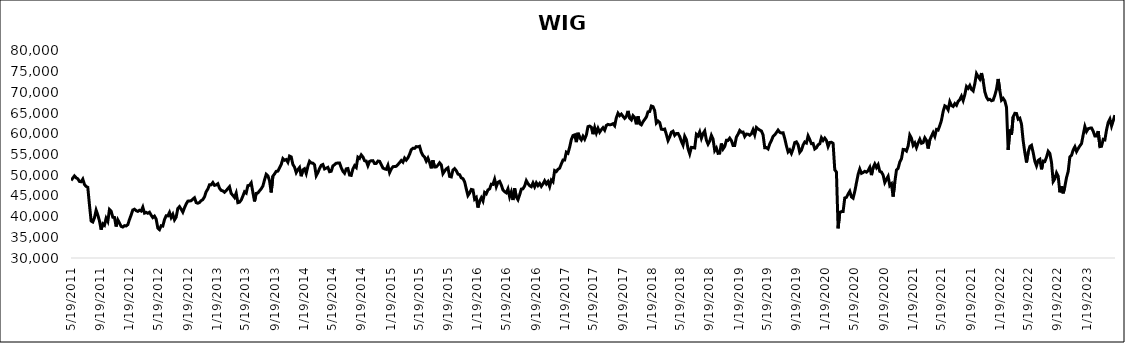
| Category | WIG |
|---|---|
| 5/19/11 | 48747.55 |
| 6/2/11 | 49824.93 |
| 6/9/11 | 49378.82 |
| 6/16/11 | 49129.21 |
| 6/23/11 | 48485.26 |
| 6/30/11 | 48414.36 |
| 7/7/11 | 49057.05 |
| 7/14/11 | 47768.38 |
| 7/21/11 | 47291.31 |
| 7/28/11 | 47071.4 |
| 8/4/11 | 42828.22 |
| 8/11/11 | 38934.71 |
| 8/18/11 | 38697.56 |
| 8/25/11 | 39715.27 |
| 9/1/11 | 41553.09 |
| 9/8/11 | 40405.17 |
| 9/15/11 | 38945 |
| 9/22/11 | 36851.2 |
| 9/29/11 | 38264.32 |
| 10/6/11 | 37915.03 |
| 10/13/11 | 39608.13 |
| 10/20/11 | 38835.92 |
| 10/27/11 | 41708.88 |
| 11/3/11 | 41313.92 |
| 11/10/11 | 39853.18 |
| 11/17/11 | 39797.19 |
| 11/24/11 | 37607.27 |
| 12/1/11 | 39215.21 |
| 12/8/11 | 38474.28 |
| 12/15/11 | 37637.47 |
| 12/22/11 | 37478.7 |
| 12/29/11 | 37814.52 |
| 1/5/12 | 37739.39 |
| 1/12/12 | 38062.87 |
| 1/19/12 | 39288.13 |
| 1/26/12 | 40392.48 |
| 2/2/12 | 41602.24 |
| 2/9/12 | 41792.46 |
| 2/16/12 | 41430.3 |
| 2/23/12 | 41258.14 |
| 3/1/12 | 41533.87 |
| 3/8/12 | 41337.97 |
| 3/15/12 | 42281.33 |
| 3/22/12 | 40834.43 |
| 3/29/12 | 41028.06 |
| 4/5/12 | 40802.41 |
| 4/12/12 | 41053.82 |
| 4/19/12 | 40354.53 |
| 4/26/12 | 39761.78 |
| 5/3/12 | 40114.73 |
| 5/10/12 | 39404.16 |
| 5/17/12 | 37228.88 |
| 5/24/12 | 36852.75 |
| 5/31/12 | 37793.58 |
| 6/7/12 | 37707.25 |
| 6/14/12 | 39286.64 |
| 6/21/12 | 40207.61 |
| 6/28/12 | 40165.34 |
| 7/5/12 | 41013.96 |
| 7/12/12 | 39778.1 |
| 7/19/12 | 40545.64 |
| 7/26/12 | 39213.05 |
| 8/2/12 | 39876.95 |
| 8/9/12 | 41976.63 |
| 8/16/12 | 42408.41 |
| 8/23/12 | 41795.63 |
| 8/30/12 | 41077.44 |
| 9/6/12 | 42134.93 |
| 9/13/12 | 43047.41 |
| 9/20/12 | 43737.02 |
| 9/27/12 | 43763.3 |
| 10/4/12 | 43840.23 |
| 10/11/12 | 44224.67 |
| 10/18/12 | 44550.12 |
| 10/25/12 | 43374.6 |
| 11/1/12 | 43232.44 |
| 11/8/12 | 43429.42 |
| 11/15/12 | 43845.94 |
| 11/22/12 | 44121.53 |
| 11/29/12 | 44787.84 |
| 12/6/12 | 46019.97 |
| 12/13/12 | 46653.84 |
| 12/20/12 | 47701.82 |
| 12/27/12 | 47673.03 |
| 1/3/13 | 48222.72 |
| 1/10/13 | 47546.91 |
| 1/17/13 | 47661.37 |
| 1/24/13 | 47942.04 |
| 1/31/13 | 46840.15 |
| 2/7/13 | 46329.66 |
| 2/14/13 | 46211.54 |
| 2/21/13 | 45879.9 |
| 2/28/13 | 46280.36 |
| 3/7/13 | 46745.26 |
| 3/14/13 | 47223.68 |
| 3/21/13 | 45580.47 |
| 3/28/13 | 45147.57 |
| 4/4/13 | 44623.89 |
| 4/11/13 | 45688.48 |
| 4/18/13 | 43364.7 |
| 4/25/13 | 43482.18 |
| 5/2/13 | 43991.51 |
| 5/9/13 | 44943.16 |
| 5/16/13 | 45992.03 |
| 5/23/13 | 45687.76 |
| 5/30/13 | 47476.64 |
| 6/6/13 | 47573.66 |
| 6/13/13 | 48152.82 |
| 6/20/13 | 45870 |
| 6/27/13 | 43667.37 |
| 7/4/13 | 45613.75 |
| 7/11/13 | 45712.72 |
| 7/18/13 | 46221.23 |
| 7/25/13 | 46713.02 |
| 8/1/13 | 47370.81 |
| 8/8/13 | 48862.88 |
| 8/15/13 | 50223.95 |
| 8/22/13 | 49846.48 |
| 8/29/13 | 48676.45 |
| 9/5/13 | 45830.66 |
| 9/12/13 | 49771.55 |
| 9/19/13 | 50300.53 |
| 9/26/13 | 50936.34 |
| 10/3/13 | 50982.03 |
| 10/10/13 | 51806.83 |
| 10/17/13 | 52573.59 |
| 10/24/13 | 53994.46 |
| 10/31/13 | 53607.86 |
| 11/7/13 | 53785.07 |
| 11/14/13 | 53127.16 |
| 11/21/13 | 54621.21 |
| 11/28/13 | 54420.19 |
| 12/5/13 | 52597.13 |
| 12/12/13 | 51947.96 |
| 12/19/13 | 50631.75 |
| 12/26/13 | 51362.3 |
| 1/2/14 | 51865.89 |
| 1/9/14 | 49753.03 |
| 1/16/14 | 51288.7 |
| 1/23/14 | 51569.21 |
| 1/30/14 | 50417.17 |
| 2/6/14 | 52138.87 |
| 2/13/14 | 53349.65 |
| 2/20/14 | 52967.02 |
| 2/27/14 | 52906.04 |
| 3/6/14 | 52487.84 |
| 3/13/14 | 49878.65 |
| 3/20/14 | 50627.71 |
| 3/27/14 | 51642.99 |
| 4/3/14 | 52376.18 |
| 4/10/14 | 52580.73 |
| 4/17/14 | 51510.98 |
| 4/24/14 | 51705.76 |
| 5/1/14 | 51892.77 |
| 5/8/14 | 50851.25 |
| 5/15/14 | 50944.5 |
| 5/22/14 | 52244.13 |
| 5/29/14 | 52553.48 |
| 6/5/14 | 52901.29 |
| 6/12/14 | 52927.91 |
| 6/19/14 | 52937.45 |
| 6/26/14 | 51815.43 |
| 7/3/14 | 50951.73 |
| 7/10/14 | 50474.36 |
| 7/17/14 | 51527.37 |
| 7/24/14 | 51613.47 |
| 7/31/14 | 50037.12 |
| 8/7/14 | 49958.67 |
| 8/14/14 | 51512.57 |
| 8/21/14 | 52294.93 |
| 8/28/14 | 51882.01 |
| 9/4/14 | 54358.49 |
| 9/11/14 | 54065.27 |
| 9/18/14 | 54906.1 |
| 9/25/14 | 54411.77 |
| 10/2/14 | 53498.77 |
| 10/9/14 | 53416.03 |
| 10/16/14 | 52297.79 |
| 10/23/14 | 53335.43 |
| 10/30/14 | 53492 |
| 11/6/14 | 53512.14 |
| 11/13/14 | 52816.35 |
| 11/20/14 | 52848.54 |
| 11/27/14 | 53415.63 |
| 12/4/14 | 53346.86 |
| 12/11/14 | 52550.03 |
| 12/18/14 | 51739.04 |
| 12/25/14 | 51511.68 |
| 1/1/15 | 51416.08 |
| 1/8/15 | 52391 |
| 1/15/15 | 50616.63 |
| 1/22/15 | 51484.81 |
| 1/29/15 | 52040.24 |
| 2/5/15 | 52107.26 |
| 2/12/15 | 52139.81 |
| 2/19/15 | 52572.95 |
| 2/26/15 | 53042.6 |
| 3/5/15 | 53546.4 |
| 3/12/15 | 53136.13 |
| 3/19/15 | 54148.48 |
| 3/26/15 | 53649.9 |
| 4/2/15 | 54179.04 |
| 4/9/15 | 55063.85 |
| 4/16/15 | 56165.1 |
| 4/23/15 | 56492.95 |
| 4/30/15 | 56477.69 |
| 5/7/15 | 56911.34 |
| 5/14/15 | 56845.83 |
| 5/21/15 | 56990.6 |
| 5/28/15 | 55556.13 |
| 6/4/15 | 54749.74 |
| 6/11/15 | 54357.69 |
| 6/18/15 | 53408.53 |
| 6/25/15 | 54141.2 |
| 7/2/15 | 53074.71 |
| 7/9/15 | 51658.71 |
| 7/16/15 | 53588.24 |
| 7/23/15 | 51986.22 |
| 7/30/15 | 52011.81 |
| 8/6/15 | 52418.07 |
| 8/13/15 | 52995.96 |
| 8/20/15 | 52508.32 |
| 8/27/15 | 50366.09 |
| 9/3/15 | 50977.06 |
| 9/10/15 | 51527.08 |
| 9/17/15 | 51801.58 |
| 9/24/15 | 49701.31 |
| 10/1/15 | 49593.95 |
| 10/8/15 | 51222.77 |
| 10/15/15 | 51599.62 |
| 10/22/15 | 51094.29 |
| 10/29/15 | 50262.68 |
| 11/5/15 | 50125.85 |
| 11/12/15 | 49358.2 |
| 11/19/15 | 49177.74 |
| 11/26/15 | 48418.14 |
| 12/3/15 | 46693.09 |
| 12/10/15 | 45093.65 |
| 12/17/15 | 45684.05 |
| 12/24/15 | 46564.08 |
| 12/31/15 | 46467.38 |
| 1/7/16 | 44195.91 |
| 1/14/16 | 44596.08 |
| 1/21/16 | 42180.3 |
| 1/28/16 | 43778.96 |
| 2/4/16 | 44557.64 |
| 2/11/16 | 43741.96 |
| 2/18/16 | 45834.88 |
| 2/25/16 | 45497.77 |
| 3/3/16 | 46448.27 |
| 3/10/16 | 46686.74 |
| 3/17/16 | 47833.39 |
| 3/24/16 | 47778.01 |
| 3/31/16 | 49017.35 |
| 4/7/16 | 47231.36 |
| 4/14/16 | 48285.21 |
| 4/21/16 | 48514.39 |
| 4/28/16 | 47643.7 |
| 5/5/16 | 46430.16 |
| 5/12/16 | 46022.02 |
| 5/19/16 | 45751.68 |
| 5/26/16 | 46695.37 |
| 6/2/16 | 44772.72 |
| 6/9/16 | 45940.12 |
| 6/16/16 | 44007.81 |
| 6/23/16 | 46826.85 |
| 6/30/16 | 44748.53 |
| 7/7/16 | 44077.16 |
| 7/14/16 | 45246.26 |
| 7/21/16 | 46639.17 |
| 7/28/16 | 46718.98 |
| 8/4/16 | 47407.09 |
| 8/11/16 | 48675.96 |
| 8/18/16 | 47967.07 |
| 8/25/16 | 47464.07 |
| 9/1/16 | 47221.32 |
| 9/8/16 | 48129.15 |
| 9/15/16 | 47198.39 |
| 9/22/16 | 48154.88 |
| 9/29/16 | 47494.62 |
| 10/6/16 | 48014.44 |
| 10/13/16 | 47303.15 |
| 10/20/16 | 47894.17 |
| 10/27/16 | 48651.28 |
| 11/3/16 | 47899.61 |
| 11/10/16 | 48447.59 |
| 11/17/16 | 47274.21 |
| 11/24/16 | 48824.83 |
| 12/1/16 | 48404.21 |
| 12/8/16 | 51123.43 |
| 12/15/16 | 50881.35 |
| 12/22/16 | 51423.71 |
| 12/29/16 | 51703.91 |
| 1/5/17 | 52721.67 |
| 1/12/17 | 53650.94 |
| 1/19/17 | 53654.99 |
| 1/26/17 | 55560.23 |
| 2/2/17 | 55303.11 |
| 2/9/17 | 56785.52 |
| 2/16/17 | 58610.28 |
| 2/23/17 | 59583.89 |
| 3/2/17 | 59743.64 |
| 3/9/17 | 57986.6 |
| 3/16/17 | 60247.18 |
| 3/23/17 | 59093.68 |
| 3/30/17 | 58527.2 |
| 4/6/17 | 59406.36 |
| 4/13/17 | 58695.36 |
| 4/20/17 | 59700.07 |
| 4/27/17 | 61731.8 |
| 5/4/17 | 61862.8 |
| 5/11/17 | 61598.78 |
| 5/18/17 | 59901.12 |
| 5/25/17 | 61536.22 |
| 6/1/17 | 60181.96 |
| 6/8/17 | 61312.68 |
| 6/15/17 | 60381.07 |
| 6/22/17 | 60987.33 |
| 6/29/17 | 61475.96 |
| 7/6/17 | 60869.83 |
| 7/13/17 | 62018.68 |
| 7/20/17 | 62269.72 |
| 7/27/17 | 62171.7 |
| 8/3/17 | 62231.08 |
| 8/10/17 | 62451.57 |
| 8/17/17 | 61949.4 |
| 8/24/17 | 63886.54 |
| 8/31/17 | 64973.76 |
| 9/7/17 | 64381.87 |
| 9/14/17 | 64748.47 |
| 9/21/17 | 64209.19 |
| 9/28/17 | 63729.77 |
| 10/5/17 | 64185.71 |
| 10/12/17 | 65529.1 |
| 10/19/17 | 63745 |
| 10/26/17 | 63342.71 |
| 11/2/17 | 64375.83 |
| 11/9/17 | 63923.62 |
| 11/16/17 | 62299.29 |
| 11/23/17 | 64207.77 |
| 11/30/17 | 62440.31 |
| 12/7/17 | 62164.65 |
| 12/14/17 | 62916.39 |
| 12/21/17 | 63477.25 |
| 12/28/17 | 64053.47 |
| 1/4/18 | 65297.96 |
| 1/11/18 | 65379.88 |
| 1/18/18 | 66709.12 |
| 1/25/18 | 66561.79 |
| 2/1/18 | 65585.79 |
| 2/8/18 | 62604.89 |
| 2/15/18 | 63078.16 |
| 2/22/18 | 62717.27 |
| 3/1/18 | 61116.96 |
| 3/8/18 | 61036.99 |
| 3/15/18 | 61156.91 |
| 3/22/18 | 59862.55 |
| 3/29/18 | 58377.42 |
| 4/5/18 | 59244.04 |
| 4/12/18 | 60393.23 |
| 4/19/18 | 60629.81 |
| 4/26/18 | 59628.04 |
| 5/3/18 | 60066.46 |
| 5/10/18 | 60091.26 |
| 5/17/18 | 59337.27 |
| 5/24/18 | 58189.49 |
| 5/31/18 | 57282.73 |
| 6/7/18 | 59412.76 |
| 6/14/18 | 58603.93 |
| 6/21/18 | 56425.25 |
| 6/28/18 | 55169.77 |
| 7/5/18 | 56719.88 |
| 7/12/18 | 56671.44 |
| 7/19/18 | 56585.5 |
| 7/26/18 | 59871.2 |
| 8/2/18 | 59484.35 |
| 8/9/18 | 60455.75 |
| 8/16/18 | 58921.44 |
| 8/23/18 | 60044.45 |
| 8/30/18 | 60690.32 |
| 9/6/18 | 58469.6 |
| 9/13/18 | 57493.38 |
| 9/20/18 | 58231.57 |
| 9/27/18 | 59616.27 |
| 10/4/18 | 58736.08 |
| 10/11/18 | 55941.06 |
| 10/18/18 | 56560.93 |
| 10/25/18 | 55271.63 |
| 11/1/18 | 55312.71 |
| 11/8/18 | 57655.73 |
| 11/15/18 | 56329.01 |
| 11/22/18 | 56932.62 |
| 11/29/18 | 58412.94 |
| 12/6/18 | 58409.09 |
| 12/13/18 | 58952.55 |
| 12/20/18 | 58349.03 |
| 12/27/18 | 57183.28 |
| 1/3/19 | 57192.42 |
| 1/10/19 | 59219.23 |
| 1/17/19 | 59894.9 |
| 1/24/19 | 60791.02 |
| 1/31/19 | 60367.42 |
| 2/7/19 | 60422.38 |
| 2/14/19 | 59348.4 |
| 2/21/19 | 59938.07 |
| 2/28/19 | 59903.7 |
| 3/7/19 | 59638.3 |
| 3/14/19 | 60002.72 |
| 3/21/19 | 60976.51 |
| 3/28/19 | 59752.66 |
| 4/4/19 | 61533.27 |
| 4/11/19 | 61168.92 |
| 4/18/19 | 60910.11 |
| 4/25/19 | 60680.62 |
| 5/2/19 | 59744.3 |
| 5/9/19 | 56637.25 |
| 5/16/19 | 56664.5 |
| 5/23/19 | 56351.13 |
| 5/30/19 | 57566.83 |
| 6/6/19 | 58360.5 |
| 6/13/19 | 59374.38 |
| 6/20/19 | 59738.56 |
| 6/27/19 | 60293.37 |
| 7/4/19 | 60888.98 |
| 7/11/19 | 60362.11 |
| 7/18/19 | 60192.6 |
| 7/25/19 | 60249.72 |
| 8/1/19 | 58863.73 |
| 8/8/19 | 57102.69 |
| 8/15/19 | 55634.7 |
| 8/22/19 | 56118.92 |
| 8/29/19 | 55273.05 |
| 9/5/19 | 56358.3 |
| 9/12/19 | 57886.6 |
| 9/19/19 | 58053.03 |
| 9/26/19 | 57377.87 |
| 10/3/19 | 55523.06 |
| 10/10/19 | 56034.97 |
| 10/17/19 | 57297.12 |
| 10/24/19 | 58012.97 |
| 10/31/19 | 57783.02 |
| 11/7/19 | 59492.22 |
| 11/14/19 | 58622.1 |
| 11/21/19 | 57618.54 |
| 11/28/19 | 57669.94 |
| 12/5/19 | 56338.75 |
| 12/12/19 | 56621.06 |
| 12/19/19 | 57346.95 |
| 12/26/19 | 57569.71 |
| 1/2/20 | 59048.28 |
| 1/9/20 | 58397.17 |
| 1/16/20 | 58962.37 |
| 1/23/20 | 58401.85 |
| 1/30/20 | 56923.36 |
| 2/6/20 | 57900.04 |
| 2/13/20 | 57960.23 |
| 2/20/20 | 57693.12 |
| 2/27/20 | 51318.69 |
| 3/5/20 | 50753.91 |
| 3/12/20 | 37164.02 |
| 3/19/20 | 41041.92 |
| 3/26/20 | 41202.98 |
| 4/2/20 | 41219.51 |
| 4/9/20 | 44499.23 |
| 4/16/20 | 44645.12 |
| 4/23/20 | 45450.43 |
| 4/30/20 | 46117 |
| 5/7/20 | 44769.05 |
| 5/14/20 | 44450.71 |
| 5/21/20 | 46073.39 |
| 5/28/20 | 48144.34 |
| 6/4/20 | 50202.54 |
| 6/11/20 | 51486.94 |
| 6/18/20 | 50445.13 |
| 6/25/20 | 50658.89 |
| 7/2/20 | 50937.18 |
| 7/9/20 | 50726.22 |
| 7/16/20 | 51121.23 |
| 7/23/20 | 51890.42 |
| 7/30/20 | 50024.63 |
| 8/6/20 | 51816.87 |
| 8/13/20 | 52706.25 |
| 8/20/20 | 51842.65 |
| 8/27/20 | 52528.67 |
| 9/3/20 | 50915.67 |
| 9/10/20 | 50757.07 |
| 9/17/20 | 50035.54 |
| 9/24/20 | 48241.11 |
| 10/1/20 | 49035.41 |
| 10/8/20 | 49727.34 |
| 10/15/20 | 47482 |
| 10/22/20 | 47910.38 |
| 10/29/20 | 44840.6 |
| 11/5/20 | 48295.31 |
| 11/12/20 | 51229.23 |
| 11/19/20 | 51651.4 |
| 11/26/20 | 53187.31 |
| 12/3/20 | 53967.82 |
| 12/10/20 | 56230.4 |
| 12/17/20 | 56176.07 |
| 12/24/20 | 55843.46 |
| 12/31/20 | 57025.84 |
| 1/7/21 | 59687.54 |
| 1/14/21 | 58945.17 |
| 1/21/21 | 57226.74 |
| 1/28/21 | 57797.95 |
| 2/4/21 | 56669.86 |
| 2/11/21 | 57790.5 |
| 2/18/21 | 58684.46 |
| 2/25/21 | 57706.4 |
| 3/4/21 | 57869.71 |
| 3/11/21 | 59028.6 |
| 3/18/21 | 58405.96 |
| 3/25/21 | 56448.66 |
| 4/1/21 | 58512.71 |
| 4/8/21 | 59435.58 |
| 4/15/21 | 60279.93 |
| 4/22/21 | 59376.35 |
| 4/29/21 | 61043.33 |
| 5/6/21 | 60898.92 |
| 5/13/21 | 62004.52 |
| 5/20/21 | 63262.41 |
| 5/27/21 | 65400.51 |
| 6/3/21 | 66757.97 |
| 6/10/21 | 66507.19 |
| 6/17/21 | 65806.48 |
| 6/24/21 | 67745.39 |
| 7/1/21 | 66836.25 |
| 7/8/21 | 66598.05 |
| 7/15/21 | 67292.59 |
| 7/22/21 | 66882.41 |
| 7/29/21 | 67833.05 |
| 8/5/21 | 68256.77 |
| 8/12/21 | 69076.8 |
| 8/19/21 | 68035.61 |
| 8/26/21 | 69454.99 |
| 9/2/21 | 71431.16 |
| 9/9/21 | 70980.21 |
| 9/16/21 | 71674.66 |
| 9/23/21 | 70725.53 |
| 9/30/21 | 70340.86 |
| 10/7/21 | 72124.89 |
| 10/14/21 | 74524.78 |
| 10/21/21 | 73818.53 |
| 10/28/21 | 73217 |
| 11/4/21 | 74659.51 |
| 11/11/21 | 72794.96 |
| 11/18/21 | 70145.47 |
| 11/25/21 | 68860.62 |
| 12/2/21 | 68203.86 |
| 12/9/21 | 68326.8 |
| 12/16/21 | 67984.08 |
| 12/23/21 | 68120.16 |
| 12/30/21 | 69296.26 |
| 1/6/22 | 70750.99 |
| 1/13/22 | 73245.28 |
| 1/20/22 | 70419.86 |
| 1/27/22 | 68131.21 |
| 2/3/22 | 68551 |
| 2/10/22 | 67939.86 |
| 2/17/22 | 66409.08 |
| 2/24/22 | 56086.65 |
| 3/3/22 | 61010.19 |
| 3/10/22 | 59796.72 |
| 3/17/22 | 64133.07 |
| 3/24/22 | 64948.68 |
| 3/31/22 | 64900.36 |
| 4/7/22 | 63524.54 |
| 4/14/22 | 63760.06 |
| 4/21/22 | 62331.7 |
| 4/28/22 | 58300.98 |
| 5/5/22 | 55467.4 |
| 5/12/22 | 53074.58 |
| 5/19/22 | 55555.31 |
| 5/26/22 | 56929.76 |
| 6/2/22 | 57227.34 |
| 6/9/22 | 55440.27 |
| 6/16/22 | 53357.34 |
| 6/23/22 | 52274.01 |
| 6/30/22 | 53573.42 |
| 7/7/22 | 53853.42 |
| 7/14/22 | 51418.11 |
| 7/21/22 | 53415.38 |
| 7/28/22 | 53324.51 |
| 8/4/22 | 54351.82 |
| 8/11/22 | 55774.95 |
| 8/18/22 | 55245.45 |
| 8/25/22 | 53074.42 |
| 9/1/22 | 48479.34 |
| 9/8/22 | 49104.24 |
| 9/15/22 | 50571.87 |
| 9/22/22 | 49765.47 |
| 9/29/22 | 45864.62 |
| 10/6/22 | 47299.55 |
| 10/13/22 | 45621.39 |
| 10/20/22 | 47283.29 |
| 10/27/22 | 49437.4 |
| 11/3/22 | 50915.87 |
| 11/10/22 | 54421.13 |
| 11/17/22 | 54791.43 |
| 11/24/22 | 56107.93 |
| 12/1/22 | 56867.54 |
| 12/8/22 | 55717.43 |
| 12/15/22 | 56450.56 |
| 12/22/22 | 57088.69 |
| 12/29/22 | 57637.95 |
| 1/5/23 | 59754.4 |
| 1/12/23 | 61751.5 |
| 1/19/23 | 60555.94 |
| 1/26/23 | 61235.79 |
| 2/2/23 | 61367.64 |
| 2/9/23 | 61394.17 |
| 2/16/23 | 60608.71 |
| 2/23/23 | 59474.66 |
| 3/2/23 | 59469 |
| 3/9/23 | 60642.79 |
| 3/16/23 | 56905.06 |
| 3/23/23 | 56983.56 |
| 3/30/23 | 58665.21 |
| 4/6/23 | 58538.87 |
| 4/13/23 | 60938.85 |
| 4/20/23 | 62756.88 |
| 4/27/23 | 63569.86 |
| 5/4/23 | 61875.44 |
| 5/11/23 | 63144.1 |
| 5/18/23 | 64514.99 |